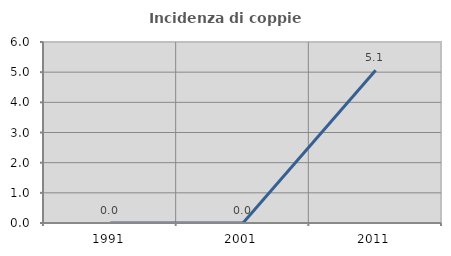
| Category | Incidenza di coppie miste |
|---|---|
| 1991.0 | 0 |
| 2001.0 | 0 |
| 2011.0 | 5.063 |